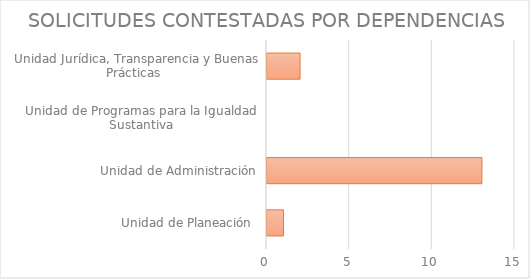
| Category | Series 1 |
|---|---|
| Unidad de Planeación  | 1 |
| Unidad de Administración | 13 |
| Unidad de Programas para la Igualdad Sustantiva | 0 |
| Unidad Jurídica, Transparencia y Buenas Prácticas  | 2 |